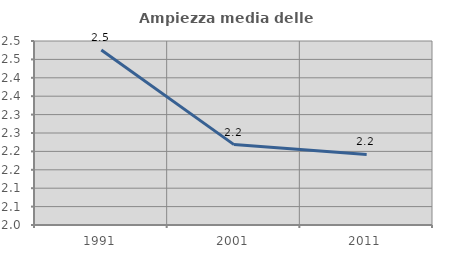
| Category | Ampiezza media delle famiglie |
|---|---|
| 1991.0 | 2.476 |
| 2001.0 | 2.218 |
| 2011.0 | 2.192 |